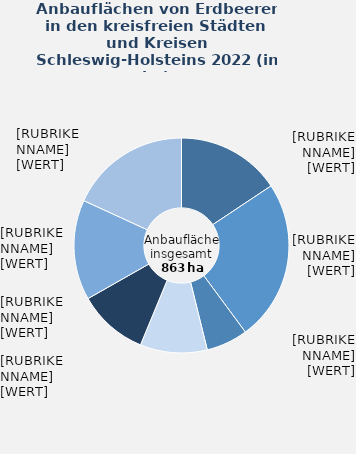
| Category | Erdbeeren |
|---|---|
| Herzogtum Lauenburg | 135 |
| Ostholstein | 209 |
| Plön | 54 |
| Schleswig-Flensburg | 87 |
| Segeberg | 91 |
| Stormarn | 130 |
| übrige kreisfreie Städte und Kreise | 156.5 |